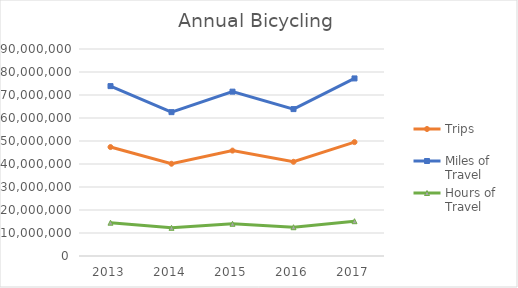
| Category | Trips | Miles of Travel | Hours of Travel |
|---|---|---|---|
| 2013 | 47367128.095 | 73861457.524 | 14478749.517 |
| 2014 | 40109910.734 | 62544988.203 | 12260429.839 |
| 2015 | 45826970.283 | 71459827.84 | 14007968.195 |
| 2016 | 40960129.917 | 63870768.985 | 12520317.045 |
| 2017 | 49511712.581 | 77205593.896 | 15134286.444 |